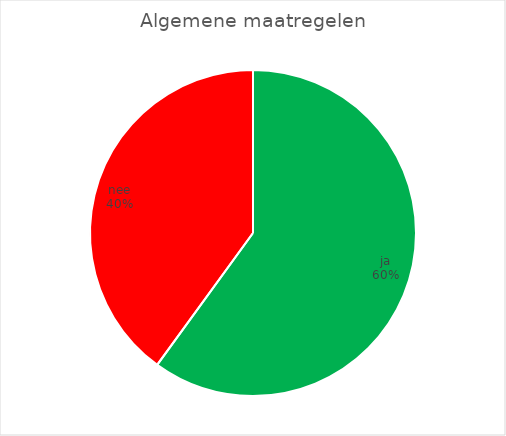
| Category | Algemene maatregelen |
|---|---|
| ja | 9 |
| nee | 6 |